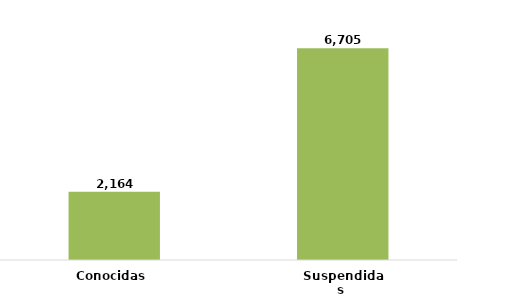
| Category | Series 0 |
|---|---|
| Conocidas  | 0.244 |
| Suspendidas  | 0.756 |